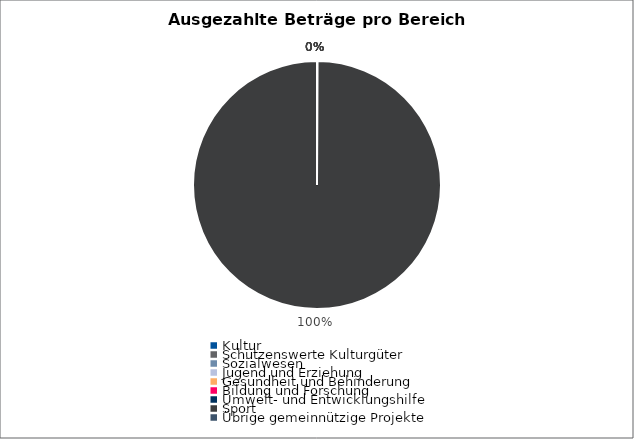
| Category | Series 0 |
|---|---|
| Kultur | 0 |
| Schützenswerte Kulturgüter | 0 |
| Sozialwesen | 0 |
| Jugend und Erziehung | 0 |
| Gesundheit und Behinderung | 0 |
| Bildung und Forschung | 0 |
| Umwelt- und Entwicklungshilfe | 0 |
| Sport | 2271724 |
| Übrige gemeinnützige Projekte | 0 |